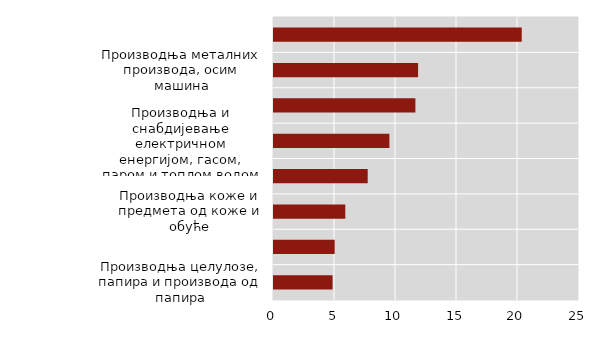
| Category | Series 0 |
|---|---|
| Производња целулозе, папира и производа од папира | 4.803 |
| Производња намјештаја и сличних производа | 4.975 |
| Производња коже и предмета од коже и обуће | 5.844 |
| Производња прехрамбених производа и пића | 7.68 |
| Производња и снабдијевање електричном енергијом, гасом, паром и топлом водом | 9.46 |
| Прерада и производи од дрвета и плуте | 11.59 |
| Производња металних производа, осим машина | 11.809 |
| Производња основних метала | 20.307 |